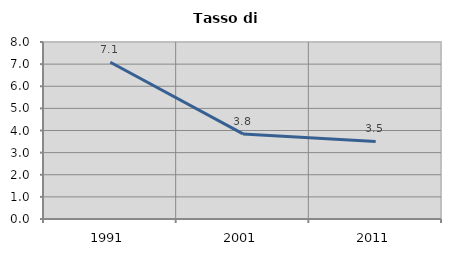
| Category | Tasso di disoccupazione   |
|---|---|
| 1991.0 | 7.085 |
| 2001.0 | 3.846 |
| 2011.0 | 3.507 |